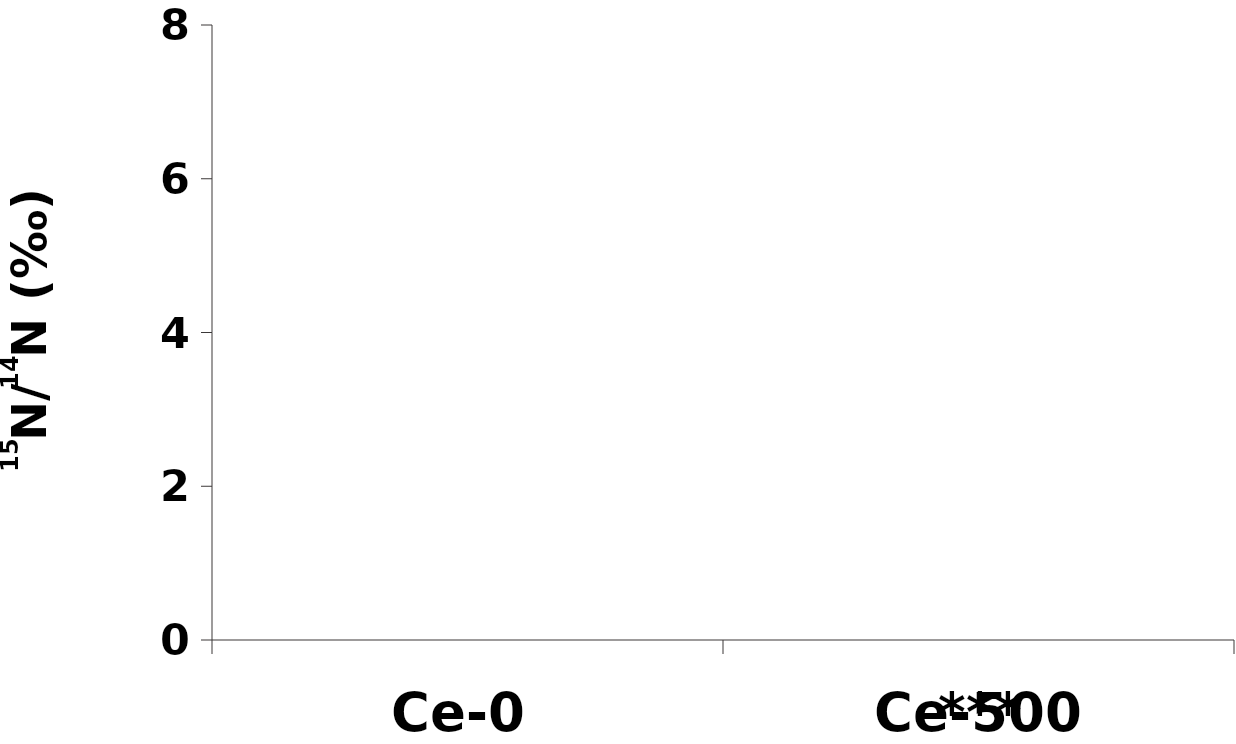
| Category | δ15N |
|---|---|
| Ce-0 | -1.266 |
| Ce-500 | -2.248 |